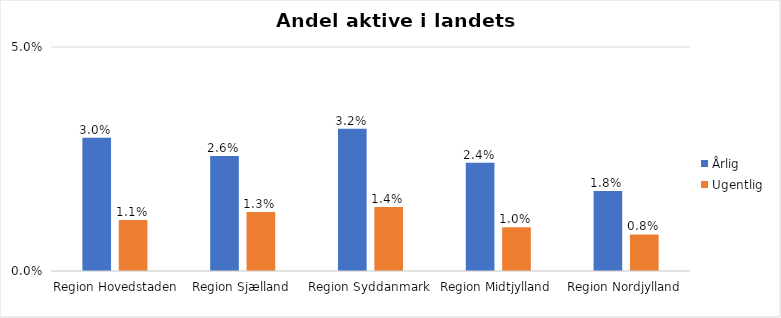
| Category | Årlig | Ugentlig |
|---|---|---|
| Region Hovedstaden | 0.03 | 0.011 |
| Region Sjælland | 0.026 | 0.013 |
| Region Syddanmark | 0.032 | 0.014 |
| Region Midtjylland | 0.024 | 0.01 |
| Region Nordjylland | 0.018 | 0.008 |